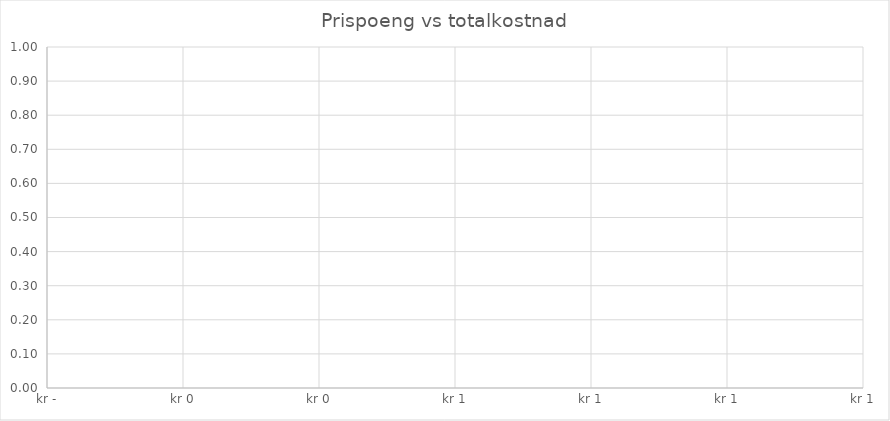
| Category | Series 0 |
|---|---|
|  | 0 |
|  | 0 |
|  | 0 |
|  | 0 |
|  | 0 |
|  | 0 |